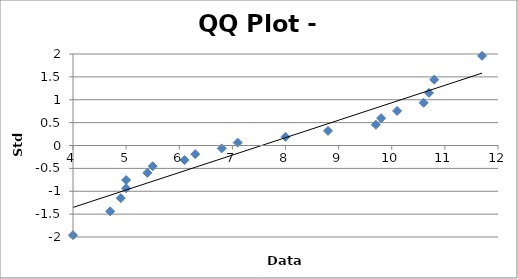
| Category | Series 0 |
|---|---|
| 4.0 | -1.96 |
| 4.7 | -1.44 |
| 4.9 | -1.15 |
| 5.0 | -0.935 |
| 5.0 | -0.755 |
| 5.4 | -0.598 |
| 5.5 | -0.454 |
| 6.1 | -0.319 |
| 6.3 | -0.189 |
| 6.8 | -0.063 |
| 7.1 | 0.063 |
| 8.0 | 0.189 |
| 8.8 | 0.319 |
| 9.7 | 0.454 |
| 9.8 | 0.598 |
| 10.1 | 0.755 |
| 10.6 | 0.935 |
| 10.7 | 1.15 |
| 10.8 | 1.44 |
| 11.7 | 1.96 |